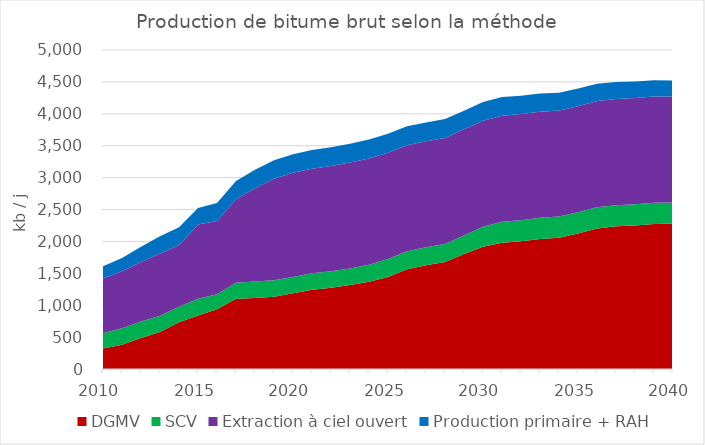
| Category | DGMV | SCV | Extraction à ciel ouvert | Production primaire + RAH |
|---|---|---|---|---|
| 2010.0 | 322.842 | 238.583 | 856.462 | 190.798 |
| 2011.0 | 379.252 | 261.05 | 893.004 | 206.633 |
| 2012.0 | 486.809 | 259.34 | 929.253 | 240.553 |
| 2013.0 | 581.29 | 252.42 | 975.92 | 271.52 |
| 2014.0 | 734.513 | 242.651 | 960.615 | 284.387 |
| 2015.0 | 839.277 | 263.168 | 1160.998 | 258.946 |
| 2016.0 | 935.211 | 237.005 | 1148.784 | 280.767 |
| 2017.0 | 1100.65 | 252.303 | 1308.642 | 284.815 |
| 2018.0 | 1113.075 | 256.992 | 1463.416 | 289.057 |
| 2019.0 | 1132.196 | 256.983 | 1593.435 | 287.806 |
| 2020.0 | 1185.629 | 256.976 | 1633.447 | 291.851 |
| 2021.0 | 1243.502 | 256.969 | 1636.885 | 295.247 |
| 2022.0 | 1274.842 | 256.963 | 1649.526 | 293.653 |
| 2023.0 | 1316.558 | 256.957 | 1661.744 | 296.402 |
| 2024.0 | 1369.367 | 266.501 | 1663.947 | 295.42 |
| 2025.0 | 1441.932 | 281.774 | 1663.947 | 297.998 |
| 2026.0 | 1562.373 | 281.944 | 1663.947 | 297.362 |
| 2027.0 | 1624.585 | 281.94 | 1663.947 | 294.534 |
| 2028.0 | 1676.685 | 281.937 | 1663.947 | 294.373 |
| 2029.0 | 1801.072 | 291.482 | 1663.947 | 292.509 |
| 2030.0 | 1915.375 | 313.123 | 1663.947 | 293.883 |
| 2031.0 | 1977.373 | 328.688 | 1663.947 | 292.67 |
| 2032.0 | 2000.949 | 331.926 | 1663.947 | 287.474 |
| 2033.0 | 2037.616 | 331.924 | 1663.947 | 283.135 |
| 2034.0 | 2057.13 | 331.922 | 1663.947 | 278.358 |
| 2035.0 | 2124.352 | 331.921 | 1663.947 | 275.162 |
| 2036.0 | 2203.418 | 331.919 | 1663.947 | 270.611 |
| 2037.0 | 2236.168 | 331.918 | 1663.947 | 265.704 |
| 2038.0 | 2249.901 | 331.917 | 1663.947 | 260.305 |
| 2039.0 | 2274.415 | 331.916 | 1663.947 | 254.918 |
| 2040.0 | 2276.536 | 331.915 | 1663.947 | 249.202 |